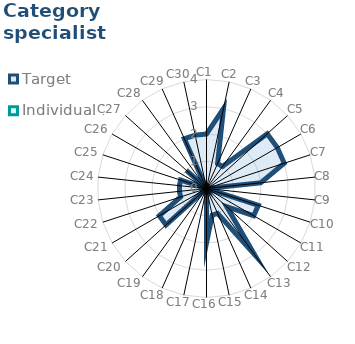
| Category | Target | Individual 1 |
|---|---|---|
| C1 | 2 | 0 |
| C2 | 3 | 0 |
| C3 | 1 | 0 |
| C4 | 1 | 0 |
| C5 | 3 | 0 |
| C6 | 3 | 0 |
| C7 | 3 | 0 |
| C8 | 2 | 0 |
| C9 | 0 | 0 |
| C10 | 2 | 0 |
| C11 | 2 | 0 |
| C12 | 1 | 0 |
| C13 | 3 | 0 |
| C14 | 1 | 0 |
| C15 | 1 | 0 |
| C16 | 2 | 0 |
| C17 | 0 | 0 |
| C18 | 0 | 0 |
| C19 | 0 | 0 |
| C20 | 2 | 0 |
| C21 | 2 | 0 |
| C22 | 1 | 0 |
| C23 | 1 | 0 |
| C24 | 1 | 0 |
| C25 | 1 | 0 |
| C26 | 0 | 0 |
| C27 | 1 | 0 |
| C28 | 0 | 0 |
| C29 | 2 | 0 |
| C30 | 2 | 0 |